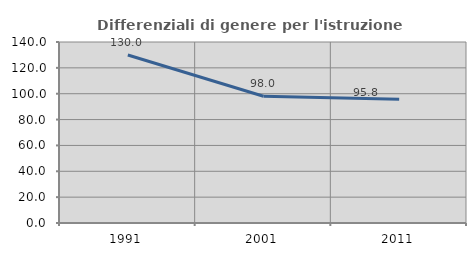
| Category | Differenziali di genere per l'istruzione superiore |
|---|---|
| 1991.0 | 129.954 |
| 2001.0 | 98.013 |
| 2011.0 | 95.789 |